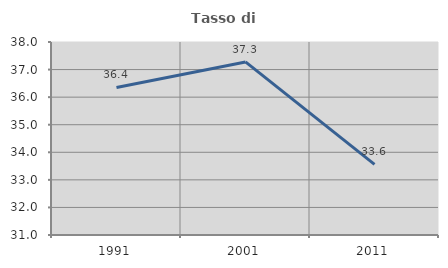
| Category | Tasso di occupazione   |
|---|---|
| 1991.0 | 36.352 |
| 2001.0 | 37.278 |
| 2011.0 | 33.564 |